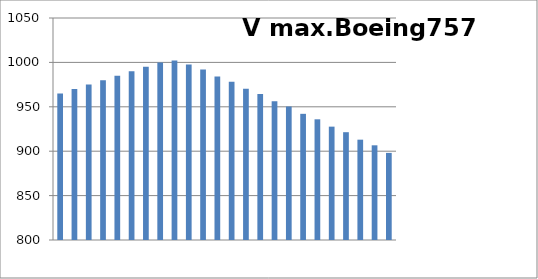
| Category | Series 0 |
|---|---|
| 0 | 965 |
| 1 | 970 |
| 2 | 975 |
| 3 | 980 |
| 4 | 985 |
| 5 | 990 |
| 6 | 995 |
| 7 | 1000 |
| 8 | 1002 |
| 9 | 997.748 |
| 10 | 991.927 |
| 11 | 984.126 |
| 12 | 978.243 |
| 13 | 970.317 |
| 14 | 964.342 |
| 15 | 956.292 |
| 16 | 950.224 |
| 17 | 942.082 |
| 18 | 935.921 |
| 19 | 927.654 |
| 20 | 921.401 |
| 21 | 912.979 |
| 22 | 906.633 |
| 23 | 898.088 |